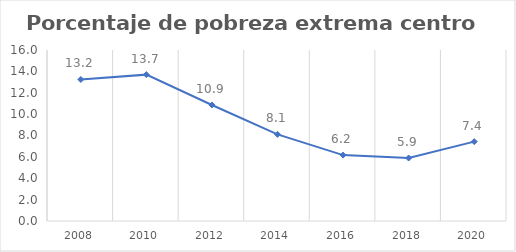
| Category | Series 0 |
|---|---|
| 2008.0 | 13.243 |
| 2010.0 | 13.695 |
| 2012.0 | 10.856 |
| 2014.0 | 8.107 |
| 2016.0 | 6.167 |
| 2018.0 | 5.892 |
| 2020.0 | 7.428 |